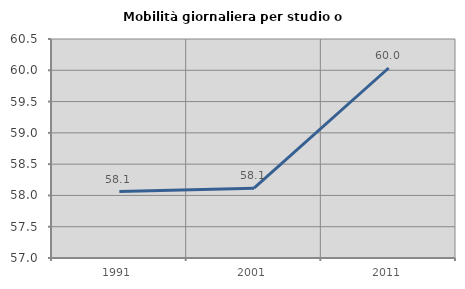
| Category | Mobilità giornaliera per studio o lavoro |
|---|---|
| 1991.0 | 58.061 |
| 2001.0 | 58.117 |
| 2011.0 | 60.037 |